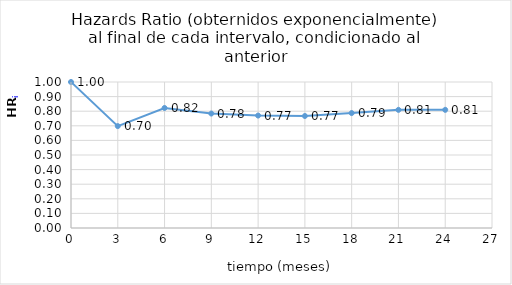
| Category | HRi |
|---|---|
| 0.0 | 1 |
| 3.0 | 0.698 |
| 6.0 | 0.822 |
| 9.0 | 0.784 |
| 12.0 | 0.77 |
| 15.0 | 0.767 |
| 18.0 | 0.787 |
| 21.0 | 0.809 |
| 24.0 | 0.809 |